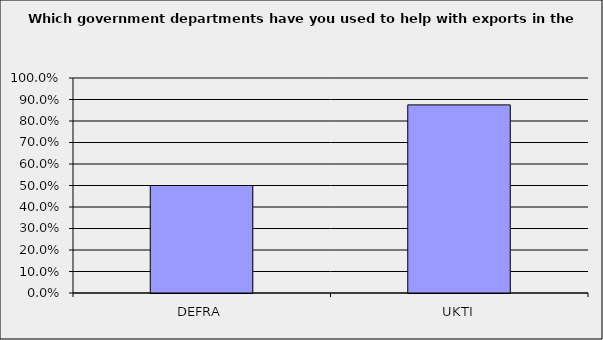
| Category | Series 0 |
|---|---|
| DEFRA | 0.5 |
| UKTI | 0.875 |